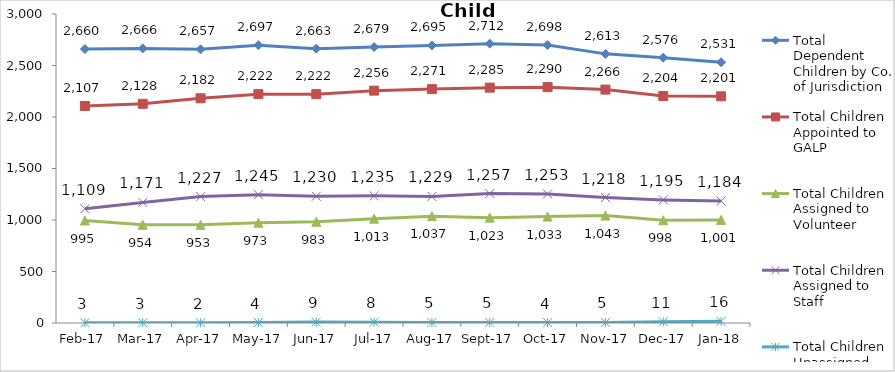
| Category | Total Dependent Children by Co. of Jurisdiction | Total Children Appointed to GALP | Total Children Assigned to Volunteer | Total Children Assigned to Staff | Total Children Unassigned |
|---|---|---|---|---|---|
| 2017-02-01 | 2660 | 2107 | 995 | 1109 | 3 |
| 2017-03-01 | 2666 | 2128 | 954 | 1171 | 3 |
| 2017-04-01 | 2657 | 2182 | 953 | 1227 | 2 |
| 2017-05-01 | 2697 | 2222 | 973 | 1245 | 4 |
| 2017-06-01 | 2663 | 2222 | 983 | 1230 | 9 |
| 2017-07-01 | 2679 | 2256 | 1013 | 1235 | 8 |
| 2017-08-01 | 2695 | 2271 | 1037 | 1229 | 5 |
| 2017-09-01 | 2712 | 2285 | 1023 | 1257 | 5 |
| 2017-10-01 | 2698 | 2290 | 1033 | 1253 | 4 |
| 2017-11-01 | 2613 | 2266 | 1043 | 1218 | 5 |
| 2017-12-01 | 2576 | 2204 | 998 | 1195 | 11 |
| 2018-01-01 | 2531 | 2201 | 1001 | 1184 | 16 |